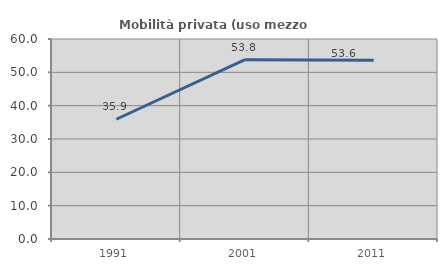
| Category | Mobilità privata (uso mezzo privato) |
|---|---|
| 1991.0 | 35.922 |
| 2001.0 | 53.801 |
| 2011.0 | 53.595 |